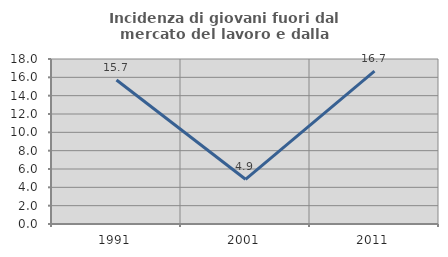
| Category | Incidenza di giovani fuori dal mercato del lavoro e dalla formazione  |
|---|---|
| 1991.0 | 15.714 |
| 2001.0 | 4.878 |
| 2011.0 | 16.667 |